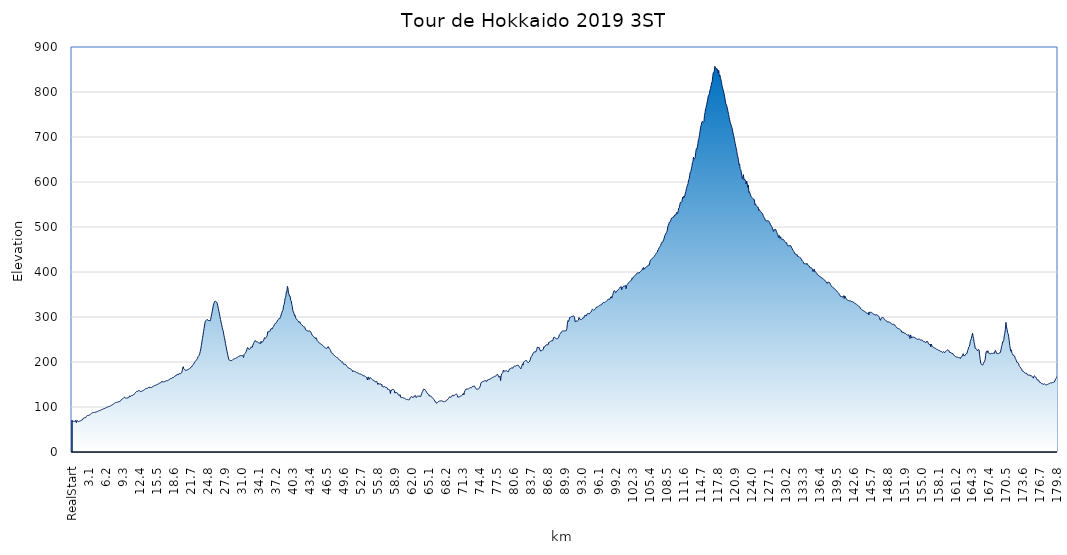
| Category | Ekevation |
|---|---|
| RealStart | 70.3 |
| 0.1  | 68.4 |
| 0.2  | 68.2 |
| 0.3  | 68.1 |
| 0.4  | 68.1 |
| 0.5  | 67.9 |
| 0.6  | 67.9 |
| 0.7  | 70.4 |
| 0.8  | 65 |
| 0.9  | 70.1 |
| 1.0  | 69.1 |
| 1.1  | 68 |
| 1.2  | 67.6 |
| 1.3  | 68.1 |
| 1.4  | 68.6 |
| 1.5  | 69 |
| 1.6  | 69.8 |
| 1.7  | 70.6 |
| 1.8  | 70.9 |
| 1.9  | 71.3 |
| 2.0  | 74.3 |
| 2.1  | 74.9 |
| 2.2  | 75.3 |
| 2.3  | 76.2 |
| 2.4  | 76.2 |
| 2.5  | 76.2 |
| 2.6  | 79 |
| 2.7  | 79.9 |
| 2.8  | 80.8 |
| 2.9  | 81.4 |
| 3.0  | 81.3 |
| 3.1  | 82 |
| 3.2  | 82.1 |
| 3.3  | 83 |
| 3.4  | 84.5 |
| 3.5  | 85.6 |
| 3.6  | 86.2 |
| 3.7  | 86.8 |
| 3.8  | 87.3 |
| 3.9  | 87.8 |
| 4.0  | 88.1 |
| 4.1  | 88 |
| 4.2  | 88.1 |
| 4.3  | 88.5 |
| 4.4  | 88.9 |
| 4.5  | 89.3 |
| 4.6  | 89.7 |
| 4.7  | 90.1 |
| 4.8  | 91 |
| 4.9  | 91.8 |
| 5.0  | 92 |
| 5.1  | 92.4 |
| 5.2  | 92.9 |
| 5.3  | 93.5 |
| 5.4  | 94.2 |
| 5.5  | 94.5 |
| 5.6  | 95.1 |
| 5.7  | 96 |
| 5.8  | 96 |
| 5.9  | 96.4 |
| 6.0  | 97 |
| 6.1  | 97.6 |
| 6.2  | 98.3 |
| 6.3  | 99 |
| 6.4  | 99.5 |
| 6.5  | 100.2 |
| 6.6  | 100.5 |
| 6.7  | 100.8 |
| 6.8  | 101.3 |
| 6.9  | 101.7 |
| 7.0  | 102.4 |
| 7.1  | 103.2 |
| 7.2  | 103.9 |
| 7.3  | 104.2 |
| 7.4  | 105.2 |
| 7.5  | 106 |
| 7.6  | 106.9 |
| 7.7  | 107.8 |
| 7.8  | 108.6 |
| 7.9  | 109.7 |
| 8.0  | 110.1 |
| 8.1  | 110.3 |
| 8.2  | 110.5 |
| 8.3  | 110.7 |
| 8.4  | 111.1 |
| 8.5  | 111.6 |
| 8.6  | 112.2 |
| 8.7  | 112.3 |
| 8.8  | 112.7 |
| 8.9  | 114.5 |
| 9.0  | 116.3 |
| 9.1  | 117.6 |
| 9.2  | 118.2 |
| 9.3  | 118.5 |
| 9.4  | 119.5 |
| 9.5  | 121.1 |
| 9.6  | 121.8 |
| 9.7  | 120.6 |
| 9.8  | 120 |
| 9.9  | 120 |
| 10.0  | 119.7 |
| 10.1  | 120.2 |
| 10.2  | 120.3 |
| 10.3  | 120.7 |
| 10.4  | 121.5 |
| 10.5  | 124.9 |
| 10.6  | 122.8 |
| 10.7  | 123.9 |
| 10.8  | 124.9 |
| 10.9  | 125.5 |
| 11.0  | 125.5 |
| 11.1  | 125.9 |
| 11.2  | 127.3 |
| 11.3  | 127.7 |
| 11.4  | 129.4 |
| 11.5  | 130.4 |
| 11.6  | 132.4 |
| 11.7  | 133.4 |
| 11.8  | 134.6 |
| 11.9  | 134 |
| 12.0  | 134.7 |
| 12.1  | 136.5 |
| 12.2  | 136.4 |
| 12.3  | 136 |
| 12.4  | 135.3 |
| 12.5  | 134.7 |
| 12.6  | 134.3 |
| 12.7  | 134.8 |
| 12.8  | 135.4 |
| 12.9  | 136.2 |
| 13.0  | 136.8 |
| 13.1  | 137.3 |
| 13.2  | 138.3 |
| 13.3  | 139.5 |
| 13.4  | 140.5 |
| 13.5  | 140.6 |
| 13.6  | 141.1 |
| 13.7  | 141.5 |
| 13.8  | 141.5 |
| 13.9  | 142.6 |
| 14.0  | 143.9 |
| 14.1  | 144.5 |
| 14.2  | 142.5 |
| 14.3  | 143.3 |
| 14.4  | 143.6 |
| 14.5  | 143.5 |
| 14.6  | 144.2 |
| 14.7  | 145 |
| 14.8  | 145.8 |
| 14.9  | 146.3 |
| 15.0  | 147.1 |
| 15.1  | 147.8 |
| 15.2  | 148.2 |
| 15.3  | 148.6 |
| 15.4  | 149 |
| 15.5  | 149 |
| 15.6  | 150.6 |
| 15.7  | 151.3 |
| 15.8  | 151.7 |
| 15.9  | 152.2 |
| 16.0  | 153.2 |
| 16.1  | 153.7 |
| 16.2  | 154.1 |
| 16.3  | 154.7 |
| 16.4  | 157.3 |
| 16.5  | 156 |
| 16.6  | 156.2 |
| 16.7  | 156 |
| 16.8  | 156.8 |
| 16.9  | 156.3 |
| 17.0  | 157.1 |
| 17.1  | 157.7 |
| 17.2  | 158.2 |
| 17.3  | 158.5 |
| 17.4  | 158.7 |
| 17.5  | 158.5 |
| 17.6  | 159.4 |
| 17.7  | 161.2 |
| 17.8  | 161.5 |
| 17.9  | 162.9 |
| 18.0  | 163 |
| 18.1  | 163.1 |
| 18.2  | 163.7 |
| 18.3  | 165.4 |
| 18.4  | 165.3 |
| 18.5  | 165.4 |
| 18.6  | 167.1 |
| 18.7  | 167.9 |
| 18.8  | 168.7 |
| 18.9  | 169 |
| 19.0  | 170.9 |
| 19.1  | 171 |
| 19.2  | 171.7 |
| 19.3  | 173.6 |
| 19.4  | 171.8 |
| 19.5  | 172.3 |
| 19.6  | 174.5 |
| 19.7  | 174.7 |
| 19.8  | 174.1 |
| 19.9  | 174.6 |
| 20.0  | 176.1 |
| 20.1  | 180.3 |
| 20.2  | 186.5 |
| 20.3  | 189.6 |
| 20.4  | 184.8 |
| 20.5  | 183.6 |
| 20.6  | 182.4 |
| 20.7  | 181.8 |
| 20.8  | 180.6 |
| 20.9  | 182.5 |
| 21.0  | 182.5 |
| 21.1  | 182.9 |
| 21.2  | 183.4 |
| 21.3  | 184.4 |
| 21.4  | 185 |
| 21.5  | 185.7 |
| 21.6  | 186.3 |
| 21.7  | 188.5 |
| 21.8  | 189.7 |
| 21.9  | 190 |
| 22.0  | 192.4 |
| 22.1  | 194.5 |
| 22.2  | 195.3 |
| 22.3  | 197.6 |
| 22.4  | 199.6 |
| 22.5  | 201.3 |
| 22.6  | 202.9 |
| 22.7  | 204.5 |
| 22.8  | 206.2 |
| 22.9  | 208.3 |
| 23.0  | 211.8 |
| 23.1  | 213.1 |
| 23.2  | 215.2 |
| 23.3  | 218.6 |
| 23.4  | 223.6 |
| 23.5  | 228.8 |
| 23.6  | 237 |
| 23.7  | 244.6 |
| 23.8  | 252.1 |
| 23.9  | 259.5 |
| 24.0  | 267.3 |
| 24.1  | 274.6 |
| 24.2  | 282.2 |
| 24.3  | 289.3 |
| 24.4  | 291.7 |
| 24.5  | 292.6 |
| 24.6  | 294.1 |
| 24.7  | 294.3 |
| 24.8  | 292.2 |
| 24.9  | 292.2 |
| 25.0  | 293 |
| 25.1  | 291.6 |
| 25.2  | 291.2 |
| 25.3  | 294.8 |
| 25.4  | 300.9 |
| 25.5  | 307 |
| 25.6  | 313.1 |
| 25.7  | 319.8 |
| 25.8  | 326.7 |
| 25.9  | 330.5 |
| 26.0  | 334 |
| 26.1  | 335.2 |
| 26.2  | 334.7 |
| 26.3  | 333.8 |
| 26.4  | 333 |
| 26.5  | 330.2 |
| 26.6  | 324.9 |
| 26.7  | 319.1 |
| 26.8  | 312.9 |
| 26.9  | 307.1 |
| 27.0  | 300.7 |
| 27.1  | 294.6 |
| 27.2  | 288.7 |
| 27.3  | 282.9 |
| 27.4  | 276.9 |
| 27.5  | 271.7 |
| 27.6  | 268.4 |
| 27.7  | 260.5 |
| 27.8  | 254.7 |
| 27.9  | 248.9 |
| 28.0  | 241.1 |
| 28.1  | 235 |
| 28.2  | 228.7 |
| 28.3  | 222.8 |
| 28.4  | 216.9 |
| 28.5  | 211.2 |
| 28.6  | 206.1 |
| 28.7  | 204 |
| 28.8  | 203.6 |
| 28.9  | 203.3 |
| 29.0  | 203 |
| 29.1  | 203.1 |
| 29.2  | 203.6 |
| 29.3  | 205 |
| 29.4  | 206 |
| 29.5  | 206.7 |
| 29.6  | 207.1 |
| 29.7  | 207.4 |
| 29.8  | 208.1 |
| 29.9  | 208.5 |
| 30.0  | 209.3 |
| 30.1  | 209.8 |
| 30.2  | 210.7 |
| 30.3  | 211.7 |
| 30.4  | 212.4 |
| 30.5  | 212.8 |
| 30.6  | 213.6 |
| 30.7  | 213.9 |
| 30.8  | 214.2 |
| 30.9  | 214.2 |
| 31.0  | 214.3 |
| 31.1  | 214.4 |
| 31.2  | 213.4 |
| 31.3  | 210 |
| 31.4  | 217 |
| 31.5  | 218.3 |
| 31.6  | 219.3 |
| 31.7  | 221.4 |
| 31.8  | 223.8 |
| 31.9  | 227.5 |
| 32.0  | 231.6 |
| 32.1  | 232 |
| 32.2  | 230.2 |
| 32.3  | 227.8 |
| 32.4  | 228.6 |
| 32.5  | 229.4 |
| 32.6  | 230.9 |
| 32.7  | 234 |
| 32.8  | 232.3 |
| 32.9  | 233.1 |
| 33.0  | 237.6 |
| 33.1  | 240.4 |
| 33.2  | 243.2 |
| 33.3  | 246 |
| 33.4  | 247.9 |
| 33.5  | 247 |
| 33.6  | 245 |
| 33.7  | 245 |
| 33.8  | 244.8 |
| 33.9  | 244 |
| 34.0  | 243 |
| 34.1  | 242.5 |
| 34.2  | 241.9 |
| 34.3  | 242.8 |
| 34.4  | 241 |
| 34.5  | 246 |
| 34.6  | 243 |
| 34.7  | 244 |
| 34.8  | 245 |
| 34.9  | 247 |
| 35.0  | 249 |
| 35.1  | 254 |
| 35.2  | 253 |
| 35.3  | 253 |
| 35.4  | 254 |
| 35.5  | 256 |
| 35.6  | 258 |
| 35.7  | 267 |
| 35.8  | 266 |
| 35.9  | 268 |
| 36.0  | 268 |
| 36.1  | 268 |
| 36.2  | 271 |
| 36.3  | 274 |
| 36.4  | 274 |
| 36.5  | 273 |
| 36.6  | 276 |
| 36.7  | 278 |
| 36.8  | 279 |
| 36.9  | 283 |
| 37.0  | 284 |
| 37.1  | 286 |
| 37.2  | 286 |
| 37.3  | 288 |
| 37.4  | 289 |
| 37.5  | 293 |
| 37.6  | 294 |
| 37.7  | 295 |
| 37.8  | 297 |
| 37.9  | 296 |
| 38.0  | 299 |
| 38.1  | 302 |
| 38.2  | 307 |
| 38.3  | 310 |
| 38.4  | 314 |
| 38.5  | 315 |
| 38.6  | 325 |
| 38.7  | 327 |
| 38.8  | 334 |
| 38.9  | 343 |
| 39.0  | 344 |
| 39.1  | 356 |
| 39.2  | 355 |
| 39.3  | 368 |
| 39.4  | 364 |
| 39.5  | 353 |
| 39.6  | 351 |
| 39.7  | 346 |
| 39.8  | 346 |
| 39.9  | 337 |
| 40.0  | 336 |
| 40.1  | 328 |
| 40.2  | 323 |
| 40.3  | 314 |
| 40.4  | 311 |
| 40.5  | 308 |
| 40.6  | 303 |
| 40.7  | 304 |
| 40.8  | 298 |
| 40.9  | 296 |
| 41.0  | 295 |
| 41.1  | 293 |
| 41.2  | 292 |
| 41.3  | 291 |
| 41.4  | 288 |
| 41.5  | 289 |
| 41.6  | 289 |
| 41.7  | 285 |
| 41.8  | 284 |
| 41.9  | 283 |
| 42.0  | 282 |
| 42.1  | 280 |
| 42.2  | 279 |
| 42.3  | 278 |
| 42.4  | 278 |
| 42.5  | 277 |
| 42.6  | 272 |
| 42.7  | 272 |
| 42.8  | 270 |
| 42.9  | 270 |
| 43.0  | 269 |
| 43.1  | 268 |
| 43.2  | 269 |
| 43.3  | 269 |
| 43.4  | 269 |
| 43.5  | 268 |
| 43.6  | 266 |
| 43.7  | 263 |
| 43.8  | 260 |
| 43.9  | 259 |
| 44.0  | 257 |
| 44.1  | 256 |
| 44.2  | 255 |
| 44.3  | 255 |
| 44.4  | 252 |
| 44.5  | 254 |
| 44.6  | 253 |
| 44.7  | 248 |
| 44.8  | 246.6 |
| 44.9  | 245.9 |
| 45.0  | 244.7 |
| 45.1  | 242.6 |
| 45.2  | 241.3 |
| 45.3  | 240.9 |
| 45.4  | 239.9 |
| 45.5  | 239 |
| 45.6  | 238.4 |
| 45.7  | 237.2 |
| 45.8  | 236.2 |
| 45.9  | 234.6 |
| 46.0  | 233.6 |
| 46.1  | 232.7 |
| 46.2  | 231.6 |
| 46.3  | 230.7 |
| 46.4  | 230.1 |
| 46.5  | 231.1 |
| 46.6  | 231.2 |
| 46.7  | 233.8 |
| 46.8  | 233.6 |
| 46.9  | 230.5 |
| 47.0  | 229 |
| 47.1  | 228 |
| 47.2  | 225 |
| 47.3  | 221 |
| 47.4  | 220 |
| 47.5  | 219.8 |
| 47.6  | 218.6 |
| 47.7  | 216.3 |
| 47.8  | 214.9 |
| 47.9  | 214.2 |
| 48.0  | 213 |
| 48.1  | 212 |
| 48.2  | 211 |
| 48.3  | 210 |
| 48.4  | 210 |
| 48.5  | 208.3 |
| 48.6  | 207.3 |
| 48.7  | 205.5 |
| 48.8  | 204.3 |
| 48.9  | 204.5 |
| 49.0  | 203.4 |
| 49.1  | 201 |
| 49.2  | 200 |
| 49.3  | 201 |
| 49.4  | 199 |
| 49.5  | 196 |
| 49.6  | 195 |
| 49.7  | 195 |
| 49.8  | 196 |
| 49.9  | 195 |
| 50.0  | 193 |
| 50.1  | 191 |
| 50.2  | 190 |
| 50.3  | 189 |
| 50.4  | 187 |
| 50.5  | 186 |
| 50.6  | 186 |
| 50.7  | 185 |
| 50.8  | 185 |
| 50.9  | 184.1 |
| 51.0  | 183.1 |
| 51.1  | 181.9 |
| 51.2  | 178.6 |
| 51.3  | 180.3 |
| 51.4  | 179.7 |
| 51.5  | 179.3 |
| 51.6  | 178.9 |
| 51.7  | 178.5 |
| 51.8  | 177.9 |
| 51.9  | 176.8 |
| 52.0  | 176.2 |
| 52.1  | 175.8 |
| 52.2  | 175.3 |
| 52.3  | 174.7 |
| 52.4  | 173.9 |
| 52.5  | 173.4 |
| 52.6  | 173.2 |
| 52.7  | 172.9 |
| 52.8  | 172.3 |
| 52.9  | 171.4 |
| 53.0  | 170.6 |
| 53.1  | 169.5 |
| 53.2  | 169.4 |
| 53.3  | 169.3 |
| 53.4  | 168.8 |
| 53.5  | 167.8 |
| 53.6  | 167.2 |
| 53.7  | 166.2 |
| 53.8  | 165.4 |
| 53.9  | 160 |
| 54.0  | 166.4 |
| 54.1  | 166.4 |
| 54.2  | 161 |
| 54.3  | 164 |
| 54.4  | 165.8 |
| 54.5  | 164.7 |
| 54.6  | 163.3 |
| 54.7  | 161.9 |
| 54.8  | 160.9 |
| 54.9  | 159.9 |
| 55.0  | 159.4 |
| 55.1  | 159 |
| 55.2  | 158 |
| 55.3  | 156 |
| 55.4  | 156 |
| 55.5  | 156 |
| 55.6  | 157 |
| 55.7  | 154 |
| 55.8  | 150 |
| 55.9  | 152.5 |
| 56.0  | 151.1 |
| 56.1  | 151 |
| 56.2  | 151.7 |
| 56.3  | 151.7 |
| 56.4  | 149.8 |
| 56.5  | 151.1 |
| 56.6  | 145 |
| 56.7  | 146 |
| 56.8  | 145 |
| 56.9  | 145 |
| 57.0  | 145.7 |
| 57.1  | 144.1 |
| 57.2  | 143.9 |
| 57.3  | 143.7 |
| 57.4  | 143.3 |
| 57.5  | 142.8 |
| 57.6  | 139 |
| 57.7  | 139 |
| 57.8  | 139 |
| 57.9  | 138.2 |
| 58.0  | 137.6 |
| 58.1  | 130 |
| 58.2  | 137.7 |
| 58.3  | 136.7 |
| 58.4  | 139 |
| 58.5  | 139 |
| 58.6  | 139.3 |
| 58.7  | 138.7 |
| 58.8  | 136.9 |
| 58.9  | 131 |
| 59.0  | 131 |
| 59.1  | 133.1 |
| 59.2  | 132.2 |
| 59.3  | 131.5 |
| 59.4  | 130.7 |
| 59.5  | 128 |
| 59.6  | 126 |
| 59.7  | 125 |
| 59.8  | 127.6 |
| 59.9  | 126.8 |
| 60.0  | 121 |
| 60.1  | 121 |
| 60.2  | 121 |
| 60.3  | 121 |
| 60.4  | 121 |
| 60.5  | 120 |
| 60.6  | 120 |
| 60.7  | 119 |
| 60.8  | 118 |
| 60.9  | 118 |
| 61.0  | 117 |
| 61.1  | 116 |
| 61.2  | 117 |
| 61.3  | 116 |
| 61.4  | 116 |
| 61.5  | 116 |
| 61.6  | 117 |
| 61.7  | 121 |
| 61.8  | 121.7 |
| 61.9  | 122.6 |
| 62.0  | 123.2 |
| 62.1  | 121 |
| 62.2  | 122 |
| 62.3  | 122 |
| 62.4  | 122 |
| 62.5  | 125 |
| 62.6  | 126 |
| 62.7  | 125 |
| 62.8  | 121 |
| 62.9  | 123 |
| 63.0  | 124 |
| 63.1  | 124 |
| 63.2  | 124 |
| 63.3  | 124 |
| 63.4  | 124 |
| 63.5  | 125 |
| 63.6  | 123 |
| 63.7  | 126 |
| 63.8  | 130 |
| 63.9  | 133 |
| 64.0  | 135 |
| 64.1  | 139 |
| 64.2  | 140 |
| 64.3  | 139 |
| 64.4  | 139 |
| 64.5  | 137 |
| 64.6  | 135 |
| 64.7  | 133 |
| 64.8  | 131 |
| 64.9  | 129 |
| 65.0  | 128 |
| 65.1  | 128 |
| 65.2  | 124 |
| 65.3  | 125.6 |
| 65.4  | 124.5 |
| 65.5  | 123 |
| 65.6  | 122.4 |
| 65.7  | 121.3 |
| 65.8  | 120.5 |
| 65.9  | 119 |
| 66.0  | 117.1 |
| 66.1  | 115.6 |
| 66.2  | 113.5 |
| 66.3  | 111.1 |
| 66.4  | 110.8 |
| 66.5  | 108.4 |
| 66.6  | 109 |
| 66.7  | 110.1 |
| 66.8  | 111.5 |
| 66.9  | 112.5 |
| 67.0  | 112.9 |
| 67.1  | 113.3 |
| 67.2  | 113.5 |
| 67.3  | 113.7 |
| 67.4  | 113.8 |
| 67.5  | 113 |
| 67.6  | 113.1 |
| 67.7  | 112.8 |
| 67.8  | 111.9 |
| 67.9  | 112 |
| 68.0  | 112 |
| 68.1  | 112 |
| 68.2  | 113 |
| 68.3  | 115 |
| 68.4  | 115 |
| 68.5  | 116 |
| 68.6  | 118 |
| 68.7  | 119 |
| 68.8  | 121 |
| 68.9  | 123 |
| 69.0  | 122 |
| 69.1  | 121 |
| 69.2  | 123 |
| 69.3  | 125 |
| 69.4  | 126 |
| 69.5  | 124 |
| 69.6  | 126 |
| 69.7  | 125.1 |
| 69.8  | 126.1 |
| 69.9  | 127.3 |
| 70.0  | 128.2 |
| 70.1  | 129 |
| 70.2  | 128.4 |
| 70.3  | 125.7 |
| 70.4  | 121.6 |
| 70.5  | 122 |
| 70.6  | 122.6 |
| 70.7  | 122.8 |
| 70.8  | 123.9 |
| 70.9  | 124.3 |
| 71.0  | 124.7 |
| 71.1  | 125.3 |
| 71.2  | 126.5 |
| 71.3  | 128.7 |
| 71.4  | 130.2 |
| 71.5  | 126.8 |
| 71.6  | 132.9 |
| 71.7  | 136.6 |
| 71.8  | 137.8 |
| 71.9  | 140 |
| 72.0  | 140 |
| 72.1  | 140 |
| 72.2  | 140 |
| 72.3  | 140 |
| 72.4  | 141 |
| 72.5  | 142 |
| 72.6  | 142 |
| 72.7  | 143 |
| 72.8  | 143 |
| 72.9  | 143 |
| 73.0  | 144 |
| 73.1  | 146 |
| 73.2  | 146 |
| 73.3  | 146 |
| 73.4  | 147 |
| 73.5  | 145 |
| 73.6  | 142.7 |
| 73.7  | 140.7 |
| 73.8  | 139.7 |
| 73.9  | 139.5 |
| 74.0  | 139.8 |
| 74.1  | 140.1 |
| 74.2  | 140.4 |
| 74.3  | 141.4 |
| 74.4  | 144 |
| 74.5  | 147 |
| 74.6  | 153 |
| 74.7  | 155 |
| 74.8  | 155.7 |
| 74.9  | 156.2 |
| 75.0  | 156.5 |
| 75.1  | 157.2 |
| 75.2  | 157.7 |
| 75.3  | 158.3 |
| 75.4  | 158 |
| 75.5  | 159 |
| 75.6  | 157 |
| 75.7  | 157 |
| 75.8  | 160 |
| 75.9  | 160 |
| 76.0  | 161 |
| 76.1  | 162 |
| 76.2  | 161 |
| 76.3  | 163 |
| 76.4  | 163 |
| 76.5  | 164 |
| 76.6  | 164.6 |
| 76.7  | 165.3 |
| 76.8  | 166.6 |
| 76.9  | 166.5 |
| 77.0  | 167.5 |
| 77.1  | 168 |
| 77.2  | 168.4 |
| 77.3  | 169 |
| 77.4  | 170.2 |
| 77.5  | 170.8 |
| 77.6  | 172.6 |
| 77.7  | 171.9 |
| 77.8  | 168.5 |
| 77.9  | 166 |
| 78.0  | 166.9 |
| 78.1  | 168.5 |
| 78.2  | 158.6 |
| 78.3  | 169.2 |
| 78.4  | 173.9 |
| 78.5  | 175.1 |
| 78.6  | 176 |
| 78.7  | 181.7 |
| 78.8  | 179.4 |
| 78.9  | 180 |
| 79.0  | 180 |
| 79.1  | 180.2 |
| 79.2  | 181.2 |
| 79.3  | 180.3 |
| 79.4  | 179.4 |
| 79.5  | 178.9 |
| 79.6  | 178.2 |
| 79.7  | 180.7 |
| 79.8  | 184.3 |
| 79.9  | 185.1 |
| 80.0  | 185.2 |
| 80.1  | 186.4 |
| 80.2  | 186.8 |
| 80.3  | 187 |
| 80.4  | 186 |
| 80.5  | 188.8 |
| 80.6  | 189.4 |
| 80.7  | 190.5 |
| 80.8  | 190.8 |
| 80.9  | 190.6 |
| 81.0  | 191.5 |
| 81.1  | 192.1 |
| 81.2  | 192.4 |
| 81.3  | 192.7 |
| 81.4  | 192.8 |
| 81.5  | 191.8 |
| 81.6  | 189.6 |
| 81.7  | 187.6 |
| 81.8  | 187 |
| 81.9  | 185 |
| 82.0  | 188 |
| 82.1  | 192 |
| 82.2  | 196 |
| 82.3  | 193 |
| 82.4  | 199.7 |
| 82.5  | 200.5 |
| 82.6  | 201.6 |
| 82.7  | 202.7 |
| 82.8  | 203.7 |
| 82.9  | 203.5 |
| 83.0  | 201.8 |
| 83.1  | 199.6 |
| 83.2  | 198.4 |
| 83.3  | 199 |
| 83.4  | 199.9 |
| 83.5  | 201.6 |
| 83.6  | 204.7 |
| 83.7  | 209 |
| 83.8  | 212 |
| 83.9  | 213.4 |
| 84.0  | 215.7 |
| 84.1  | 218.2 |
| 84.2  | 220.6 |
| 84.3  | 220.8 |
| 84.4  | 222.9 |
| 84.5  | 223 |
| 84.6  | 222 |
| 84.7  | 225 |
| 84.8  | 228 |
| 84.9  | 233 |
| 85.0  | 232 |
| 85.1  | 232 |
| 85.2  | 233 |
| 85.3  | 229.1 |
| 85.4  | 226.8 |
| 85.5  | 224 |
| 85.6  | 225.6 |
| 85.7  | 225.1 |
| 85.8  | 226.7 |
| 85.9  | 227.7 |
| 86.0  | 228 |
| 86.1  | 234 |
| 86.2  | 233 |
| 86.3  | 235 |
| 86.4  | 237 |
| 86.5  | 238 |
| 86.6  | 238.1 |
| 86.7  | 237.1 |
| 86.8  | 239.3 |
| 86.9  | 239 |
| 87.0  | 244 |
| 87.1  | 244 |
| 87.2  | 245 |
| 87.3  | 246 |
| 87.4  | 247 |
| 87.5  | 247 |
| 87.6  | 247 |
| 87.7  | 247 |
| 87.8  | 251.1 |
| 87.9  | 255.1 |
| 88.0  | 255.5 |
| 88.1  | 254.1 |
| 88.2  | 253.3 |
| 88.3  | 252.5 |
| 88.4  | 251.7 |
| 88.5  | 251.1 |
| 88.6  | 251.7 |
| 88.7  | 253.3 |
| 88.8  | 255 |
| 88.9  | 260.1 |
| 89.0  | 261.2 |
| 89.1  | 263.5 |
| 89.2  | 264.2 |
| 89.3  | 267 |
| 89.4  | 268 |
| 89.5  | 269 |
| 89.6  | 269 |
| 89.7  | 269 |
| 89.8  | 269 |
| 89.9  | 269 |
| 90.0  | 269 |
| 90.1  | 270 |
| 90.2  | 270 |
| 90.3  | 275 |
| 90.4  | 287 |
| 90.5  | 292 |
| 90.6  | 290 |
| 90.7  | 293.8 |
| 90.8  | 299.1 |
| 90.9  | 299 |
| 91.0  | 299.7 |
| 91.1  | 300.6 |
| 91.2  | 301.3 |
| 91.3  | 301.4 |
| 91.4  | 301 |
| 91.5  | 302.9 |
| 91.6  | 301.4 |
| 91.7  | 298.1 |
| 91.8  | 289.3 |
| 91.9  | 290 |
| 92.0  | 292 |
| 92.1  | 290.3 |
| 92.2  | 290.7 |
| 92.3  | 291.9 |
| 92.4  | 292.9 |
| 92.5  | 299 |
| 92.6  | 296 |
| 92.7  | 296 |
| 92.8  | 294 |
| 92.9  | 294 |
| 93.0  | 295 |
| 93.1  | 296 |
| 93.2  | 298 |
| 93.3  | 298 |
| 93.4  | 298 |
| 93.5  | 303 |
| 93.6  | 303 |
| 93.7  | 304 |
| 93.8  | 302 |
| 93.9  | 304 |
| 94.0  | 307 |
| 94.1  | 308 |
| 94.2  | 308 |
| 94.3  | 307 |
| 94.4  | 307 |
| 94.5  | 309.3 |
| 94.6  | 309.9 |
| 94.7  | 311.3 |
| 94.8  | 314 |
| 94.9  | 317 |
| 95.0  | 317 |
| 95.1  | 316 |
| 95.2  | 315 |
| 95.3  | 316 |
| 95.4  | 317 |
| 95.5  | 319 |
| 95.6  | 320 |
| 95.7  | 322 |
| 95.8  | 321.7 |
| 95.9  | 322.5 |
| 96.0  | 323.4 |
| 96.1  | 324.6 |
| 96.2  | 325.4 |
| 96.3  | 326 |
| 96.4  | 326.6 |
| 96.5  | 327 |
| 96.6  | 327.3 |
| 96.7  | 328.7 |
| 96.8  | 330.8 |
| 96.9  | 332 |
| 97.0  | 332.2 |
| 97.1  | 332.1 |
| 97.2  | 332.2 |
| 97.3  | 332.9 |
| 97.4  | 334.1 |
| 97.5  | 335.4 |
| 97.6  | 336.6 |
| 97.7  | 337.7 |
| 97.8  | 338.4 |
| 97.9  | 339.3 |
| 98.0  | 340.4 |
| 98.1  | 339 |
| 98.2  | 342 |
| 98.3  | 344.3 |
| 98.4  | 345.3 |
| 98.5  | 342 |
| 98.6  | 347.5 |
| 98.7  | 350.8 |
| 98.8  | 354.9 |
| 98.9  | 358.4 |
| 99.0  | 358.4 |
| 99.1  | 356.6 |
| 99.2  | 354 |
| 99.3  | 356 |
| 99.4  | 358 |
| 99.5  | 359 |
| 99.6  | 359 |
| 99.7  | 361 |
| 99.8  | 363 |
| 99.9  | 364.2 |
| 100.0  | 366 |
| 100.1  | 366.6 |
| 100.2  | 367.8 |
| 100.3  | 360.5 |
| 100.4  | 365.6 |
| 100.5  | 366 |
| 100.6  | 368 |
| 100.7  | 368.5 |
| 100.8  | 368.9 |
| 100.9  | 369.3 |
| 101.0  | 369.8 |
| 101.1  | 362.7 |
| 101.2  | 370.3 |
| 101.3  | 371.9 |
| 101.4  | 373.5 |
| 101.5  | 375.1 |
| 101.6  | 376.5 |
| 101.7  | 377.9 |
| 101.8  | 379.3 |
| 101.9  | 380.6 |
| 102.0  | 380.9 |
| 102.1  | 382 |
| 102.2  | 387 |
| 102.3  | 386 |
| 102.4  | 388 |
| 102.5  | 390 |
| 102.6  | 391 |
| 102.7  | 392 |
| 102.8  | 393 |
| 102.9  | 394 |
| 103.0  | 396 |
| 103.1  | 398 |
| 103.2  | 398 |
| 103.3  | 398 |
| 103.4  | 398 |
| 103.5  | 398 |
| 103.6  | 400 |
| 103.7  | 401 |
| 103.8  | 402 |
| 103.9  | 403 |
| 104.0  | 404.4 |
| 104.1  | 407.6 |
| 104.2  | 405.6 |
| 104.3  | 410.3 |
| 104.4  | 406.8 |
| 104.5  | 407.1 |
| 104.6  | 408.7 |
| 104.7  | 410.4 |
| 104.8  | 411.6 |
| 104.9  | 412.4 |
| 105.0  | 412.9 |
| 105.1  | 413.8 |
| 105.2  | 415.7 |
| 105.3  | 415 |
| 105.4  | 420.7 |
| 105.5  | 424.9 |
| 105.6  | 427.3 |
| 105.7  | 428.3 |
| 105.8  | 429.4 |
| 105.9  | 430.4 |
| 106.0  | 431.5 |
| 106.1  | 432.8 |
| 106.2  | 434.1 |
| 106.3  | 436.1 |
| 106.4  | 437.9 |
| 106.5  | 439.4 |
| 106.6  | 441.3 |
| 106.7  | 443.3 |
| 106.8  | 444.3 |
| 106.9  | 449 |
| 107.0  | 450 |
| 107.1  | 454 |
| 107.2  | 455 |
| 107.3  | 457 |
| 107.4  | 459 |
| 107.5  | 463 |
| 107.6  | 466 |
| 107.7  | 466 |
| 107.8  | 467 |
| 107.9  | 471 |
| 108.0  | 473 |
| 108.1  | 478 |
| 108.2  | 482 |
| 108.3  | 484 |
| 108.4  | 487 |
| 108.5  | 488 |
| 108.6  | 492 |
| 108.7  | 500 |
| 108.8  | 504 |
| 108.9  | 507 |
| 109.0  | 511 |
| 109.1  | 511 |
| 109.2  | 512 |
| 109.3  | 517 |
| 109.4  | 520 |
| 109.5  | 521 |
| 109.6  | 521 |
| 109.7  | 521 |
| 109.8  | 524 |
| 109.9  | 524 |
| 110.0  | 527 |
| 110.1  | 527 |
| 110.2  | 527 |
| 110.3  | 532 |
| 110.4  | 532 |
| 110.5  | 530 |
| 110.6  | 536 |
| 110.7  | 542 |
| 110.8  | 543 |
| 110.9  | 549 |
| 111.0  | 555 |
| 111.1  | 554 |
| 111.2  | 555 |
| 111.3  | 557 |
| 111.4  | 566 |
| 111.5  | 564 |
| 111.6  | 568 |
| 111.7  | 566 |
| 111.8  | 569 |
| 111.9  | 575 |
| 112.0  | 579 |
| 112.1  | 585 |
| 112.2  | 589 |
| 112.3  | 593 |
| 112.4  | 596 |
| 112.5  | 605 |
| 112.6  | 606 |
| 112.7  | 615 |
| 112.8  | 622 |
| 112.9  | 623 |
| 113.0  | 629 |
| 113.1  | 634 |
| 113.2  | 643 |
| 113.3  | 646 |
| 113.4  | 655 |
| 113.5  | 651 |
| 113.6  | 652 |
| 113.7  | 654 |
| 113.8  | 665 |
| 113.9  | 674 |
| 114.0  | 673 |
| 114.1  | 678 |
| 114.2  | 685 |
| 114.3  | 695 |
| 114.4  | 697 |
| 114.5  | 706 |
| 114.6  | 713 |
| 114.7  | 722 |
| 114.8  | 726 |
| 114.9  | 732 |
| 115.0  | 735 |
| 115.1  | 734 |
| 115.2  | 733 |
| 115.3  | 734 |
| 115.4  | 748 |
| 115.5  | 754 |
| 115.6  | 763 |
| 115.7  | 766 |
| 115.8  | 772 |
| 115.9  | 778 |
| 116.0  | 784 |
| 116.1  | 792 |
| 116.2  | 793 |
| 116.3  | 797 |
| 116.4  | 804 |
| 116.5  | 808 |
| 116.6  | 814 |
| 116.7  | 820 |
| 116.8  | 823 |
| 116.9  | 834 |
| 117.0  | 843 |
| 117.1  | 843 |
| 117.2  | 847 |
| 117.3  | 857 |
| 117.4  | 853 |
| 117.5  | 853 |
| 117.6  | 852 |
| 117.7  | 852 |
| 117.8  | 846 |
| 117.9  | 842 |
| 118.0  | 848 |
| 118.1  | 835 |
| 118.2  | 838 |
| 118.3  | 832.4 |
| 118.4  | 827.2 |
| 118.5  | 821.8 |
| 118.6  | 814.5 |
| 118.7  | 809.3 |
| 118.8  | 804.9 |
| 118.9  | 799.9 |
| 119.0  | 794.9 |
| 119.1  | 787.9 |
| 119.2  | 780.4 |
| 119.3  | 771.9 |
| 119.4  | 771.8 |
| 119.5  | 767.1 |
| 119.6  | 761.9 |
| 119.7  | 755.7 |
| 119.8  | 750 |
| 119.9  | 743.3 |
| 120.0  | 738 |
| 120.1  | 732.2 |
| 120.2  | 728.5 |
| 120.3  | 724.7 |
| 120.4  | 721 |
| 120.5  | 715.5 |
| 120.6  | 709.1 |
| 120.7  | 704 |
| 120.8  | 697.9 |
| 120.9  | 692 |
| 121.0  | 685.6 |
| 121.1  | 679.6 |
| 121.2  | 674.3 |
| 121.3  | 667.2 |
| 121.4  | 659.5 |
| 121.5  | 655.3 |
| 121.6  | 648.5 |
| 121.7  | 638.2 |
| 121.8  | 640.3 |
| 121.9  | 629.4 |
| 122.0  | 628 |
| 122.1  | 622.2 |
| 122.2  | 614.9 |
| 122.3  | 607 |
| 122.4  | 609.8 |
| 122.5  | 616.4 |
| 122.6  | 605.4 |
| 122.7  | 607 |
| 122.8  | 604.6 |
| 122.9  | 601.6 |
| 123.0  | 595.5 |
| 123.1  | 602.2 |
| 123.2  | 596.7 |
| 123.3  | 588 |
| 123.4  | 593.1 |
| 123.5  | 577.1 |
| 123.6  | 578.4 |
| 123.7  | 575 |
| 123.8  | 571.3 |
| 123.9  | 567.9 |
| 124.0  | 566.2 |
| 124.1  | 564.6 |
| 124.2  | 563.3 |
| 124.3  | 562.3 |
| 124.4  | 562.1 |
| 124.5  | 560.2 |
| 124.6  | 549.5 |
| 124.7  | 551.5 |
| 124.8  | 548.3 |
| 124.9  | 546.2 |
| 125.0  | 545.7 |
| 125.1  | 543.5 |
| 125.2  | 543.9 |
| 125.3  | 536.9 |
| 125.4  | 538.7 |
| 125.5  | 536.5 |
| 125.6  | 534.5 |
| 125.7  | 533.4 |
| 125.8  | 532.7 |
| 125.9  | 530.9 |
| 126.0  | 529 |
| 126.1  | 525.9 |
| 126.2  | 523 |
| 126.3  | 520.6 |
| 126.4  | 518.7 |
| 126.5  | 515.1 |
| 126.6  | 514.2 |
| 126.7  | 512.7 |
| 126.8  | 514.7 |
| 126.9  | 513.4 |
| 127.0  | 512.9 |
| 127.1  | 513.7 |
| 127.2  | 511.7 |
| 127.3  | 509.7 |
| 127.4  | 506.2 |
| 127.5  | 504.6 |
| 127.6  | 501.8 |
| 127.7  | 500.2 |
| 127.8  | 497.4 |
| 127.9  | 493.1 |
| 128.0  | 490.2 |
| 128.1  | 494.5 |
| 128.2  | 494.1 |
| 128.3  | 494.7 |
| 128.4  | 494.5 |
| 128.5  | 490.6 |
| 128.6  | 487.8 |
| 128.7  | 484.8 |
| 128.8  | 482.6 |
| 128.9  | 476.8 |
| 129.0  | 481 |
| 129.1  | 480.3 |
| 129.2  | 474.6 |
| 129.3  | 478.1 |
| 129.4  | 474.4 |
| 129.5  | 472 |
| 129.6  | 472.8 |
| 129.7  | 472.9 |
| 129.8  | 472.3 |
| 129.9  | 470.5 |
| 130.0  | 468.6 |
| 130.1  | 467.7 |
| 130.2  | 465.4 |
| 130.3  | 465 |
| 130.4  | 465 |
| 130.5  | 460.5 |
| 130.6  | 458.4 |
| 130.7  | 457.5 |
| 130.8  | 459.3 |
| 130.9  | 458.1 |
| 131.0  | 459.5 |
| 131.1  | 458.7 |
| 131.2  | 457.5 |
| 131.3  | 453.7 |
| 131.4  | 452.2 |
| 131.5  | 449 |
| 131.6  | 447.6 |
| 131.7  | 445.7 |
| 131.8  | 443.9 |
| 131.9  | 440 |
| 132.0  | 439.7 |
| 132.1  | 438.9 |
| 132.2  | 438.5 |
| 132.3  | 438.7 |
| 132.4  | 434.3 |
| 132.5  | 434.2 |
| 132.6  | 434.7 |
| 132.7  | 433.6 |
| 132.8  | 432.3 |
| 132.9  | 431.2 |
| 133.0  | 430.2 |
| 133.1  | 428.8 |
| 133.2  | 425.5 |
| 133.3  | 424 |
| 133.4  | 422.9 |
| 133.5  | 419.6 |
| 133.6  | 418 |
| 133.7  | 418.4 |
| 133.8  | 418.6 |
| 133.9  | 417.9 |
| 134.0  | 417.4 |
| 134.1  | 419.3 |
| 134.2  | 415.8 |
| 134.3  | 415.3 |
| 134.4  | 414.7 |
| 134.5  | 413.7 |
| 134.6  | 410 |
| 134.7  | 409.4 |
| 134.8  | 409.8 |
| 134.9  | 409.4 |
| 135.0  | 408.2 |
| 135.1  | 406.3 |
| 135.2  | 400.9 |
| 135.3  | 403.4 |
| 135.4  | 406.7 |
| 135.5  | 400.6 |
| 135.6  | 401.5 |
| 135.7  | 399.9 |
| 135.8  | 397.9 |
| 135.9  | 396.6 |
| 136.0  | 394 |
| 136.1  | 393.4 |
| 136.2  | 392.8 |
| 136.3  | 391.1 |
| 136.4  | 390.2 |
| 136.5  | 390 |
| 136.6  | 389 |
| 136.7  | 387.1 |
| 136.8  | 386.8 |
| 136.9  | 386.5 |
| 137.0  | 385.3 |
| 137.1  | 384 |
| 137.2  | 383.2 |
| 137.3  | 382.4 |
| 137.4  | 380.7 |
| 137.5  | 379.3 |
| 137.6  | 378 |
| 137.7  | 375.6 |
| 137.8  | 374.5 |
| 137.9  | 377.4 |
| 138.0  | 377.1 |
| 138.1  | 377.3 |
| 138.2  | 376.8 |
| 138.3  | 375.2 |
| 138.4  | 372.4 |
| 138.5  | 369.6 |
| 138.6  | 367.9 |
| 138.7  | 367.4 |
| 138.8  | 365.8 |
| 138.9  | 365.2 |
| 139.0  | 364.7 |
| 139.1  | 362.8 |
| 139.2  | 361.6 |
| 139.3  | 360.9 |
| 139.4  | 359.4 |
| 139.5  | 358.3 |
| 139.6  | 356.7 |
| 139.7  | 355.3 |
| 139.8  | 354.1 |
| 139.9  | 352.9 |
| 140.0  | 350.1 |
| 140.1  | 348.6 |
| 140.2  | 345.8 |
| 140.3  | 346.5 |
| 140.4  | 345.6 |
| 140.5  | 344.3 |
| 140.6  | 344 |
| 140.7  | 346.7 |
| 140.8  | 347.2 |
| 140.9  | 341 |
| 141.0  | 347 |
| 141.1  | 344.4 |
| 141.2  | 341.9 |
| 141.3  | 339.4 |
| 141.4  | 338.4 |
| 141.5  | 337.7 |
| 141.6  | 337.1 |
| 141.7  | 336.6 |
| 141.8  | 336.4 |
| 141.9  | 335.5 |
| 142.0  | 335.8 |
| 142.1  | 335.7 |
| 142.2  | 334.6 |
| 142.3  | 334.1 |
| 142.4  | 334 |
| 142.5  | 333.4 |
| 142.6  | 332.8 |
| 142.7  | 331.4 |
| 142.8  | 330.8 |
| 142.9  | 329.6 |
| 143.0  | 329.2 |
| 143.1  | 328.5 |
| 143.2  | 327.4 |
| 143.3  | 326.3 |
| 143.4  | 325.7 |
| 143.5  | 324.7 |
| 143.6  | 323 |
| 143.7  | 322.4 |
| 143.8  | 320.7 |
| 143.9  | 318.2 |
| 144.0  | 317.5 |
| 144.1  | 316.2 |
| 144.2  | 315.2 |
| 144.3  | 314.8 |
| 144.4  | 314 |
| 144.5  | 312.9 |
| 144.6  | 312.8 |
| 144.7  | 311.5 |
| 144.8  | 310.6 |
| 144.9  | 309.4 |
| 145.0  | 308.4 |
| 145.1  | 307.4 |
| 145.2  | 308.5 |
| 145.3  | 310 |
| 145.4  | 304.6 |
| 145.5  | 310.7 |
| 145.6  | 310.8 |
| 145.7  | 310.4 |
| 145.8  | 311 |
| 145.9  | 309.8 |
| 146.0  | 308.6 |
| 146.1  | 307.8 |
| 146.2  | 307.1 |
| 146.3  | 306 |
| 146.4  | 305.7 |
| 146.5  | 304.2 |
| 146.6  | 304.5 |
| 146.7  | 305.1 |
| 146.8  | 305.1 |
| 146.9  | 304.3 |
| 147.0  | 303.8 |
| 147.1  | 302.9 |
| 147.2  | 301 |
| 147.3  | 298.9 |
| 147.4  | 295.4 |
| 147.5  | 292.6 |
| 147.6  | 296.6 |
| 147.7  | 297.7 |
| 147.8  | 298.8 |
| 147.9  | 298.8 |
| 148.0  | 298.8 |
| 148.1  | 296.9 |
| 148.2  | 295.7 |
| 148.3  | 294.6 |
| 148.4  | 293.2 |
| 148.5  | 291.6 |
| 148.6  | 290.8 |
| 148.7  | 290 |
| 148.8  | 289.2 |
| 148.9  | 288.9 |
| 149.0  | 289 |
| 149.1  | 288.6 |
| 149.2  | 288.5 |
| 149.3  | 287.1 |
| 149.4  | 286.1 |
| 149.5  | 285.1 |
| 149.6  | 284.6 |
| 149.7  | 283.7 |
| 149.8  | 283.9 |
| 149.9  | 283.7 |
| 150.0  | 283.3 |
| 150.1  | 282.5 |
| 150.2  | 280 |
| 150.3  | 279 |
| 150.4  | 278 |
| 150.5  | 276 |
| 150.6  | 275 |
| 150.7  | 274 |
| 150.8  | 274 |
| 150.9  | 274 |
| 151.0  | 273 |
| 151.1  | 272 |
| 151.2  | 271 |
| 151.3  | 269 |
| 151.4  | 266 |
| 151.5  | 267 |
| 151.6  | 265 |
| 151.7  | 266 |
| 151.8  | 264 |
| 151.9  | 264 |
| 152.0  | 264 |
| 152.1  | 263 |
| 152.2  | 261.7 |
| 152.3  | 261 |
| 152.4  | 260 |
| 152.5  | 259.7 |
| 152.6  | 259.7 |
| 152.7  | 260.7 |
| 152.8  | 254.4 |
| 152.9  | 252 |
| 153.0  | 260.3 |
| 153.1  | 257.1 |
| 153.2  | 253.4 |
| 153.3  | 254.7 |
| 153.4  | 255.6 |
| 153.5  | 255.4 |
| 153.6  | 254.7 |
| 153.7  | 254.7 |
| 153.8  | 254.1 |
| 153.9  | 253.2 |
| 154.0  | 252.5 |
| 154.1  | 250.9 |
| 154.2  | 250.5 |
| 154.3  | 250.3 |
| 154.4  | 251 |
| 154.5  | 251 |
| 154.6  | 251 |
| 154.7  | 249.9 |
| 154.8  | 249 |
| 154.9  | 248.5 |
| 155.0  | 249 |
| 155.1  | 249 |
| 155.2  | 247 |
| 155.3  | 246 |
| 155.4  | 245.1 |
| 155.5  | 245.4 |
| 155.6  | 244.9 |
| 155.7  | 243.4 |
| 155.8  | 242.8 |
| 155.9  | 245.5 |
| 156.0  | 245.7 |
| 156.1  | 245.6 |
| 156.2  | 242.7 |
| 156.3  | 240.1 |
| 156.4  | 238.7 |
| 156.5  | 238.2 |
| 156.6  | 240 |
| 156.7  | 233.6 |
| 156.8  | 240 |
| 156.9  | 236 |
| 157.0  | 234.4 |
| 157.1  | 233.1 |
| 157.2  | 232.6 |
| 157.3  | 231.4 |
| 157.4  | 231.3 |
| 157.5  | 230.7 |
| 157.6  | 229.7 |
| 157.7  | 228.3 |
| 157.8  | 228.4 |
| 157.9  | 227.9 |
| 158.0  | 226.6 |
| 158.1  | 226 |
| 158.2  | 225.7 |
| 158.3  | 225.1 |
| 158.4  | 224.6 |
| 158.5  | 223.6 |
| 158.6  | 223.7 |
| 158.7  | 222 |
| 158.8  | 221.1 |
| 158.9  | 221.8 |
| 159.0  | 223.1 |
| 159.1  | 222.1 |
| 159.2  | 220.6 |
| 159.3  | 223 |
| 159.4  | 223.1 |
| 159.5  | 224.2 |
| 159.6  | 225.6 |
| 159.7  | 226.8 |
| 159.8  | 227 |
| 159.9  | 226.4 |
| 160.0  | 225.2 |
| 160.1  | 221.9 |
| 160.2  | 220.6 |
| 160.3  | 222.1 |
| 160.4  | 220.2 |
| 160.5  | 218.8 |
| 160.6  | 217.9 |
| 160.7  | 219.4 |
| 160.8  | 216.4 |
| 160.9  | 215.4 |
| 161.0  | 213.8 |
| 161.1  | 213.2 |
| 161.2  | 212.5 |
| 161.3  | 211.4 |
| 161.4  | 210.9 |
| 161.5  | 211 |
| 161.6  | 210.7 |
| 161.7  | 209.8 |
| 161.8  | 209.6 |
| 161.9  | 209 |
| 162.0  | 210.3 |
| 162.1  | 207.8 |
| 162.2  | 209.8 |
| 162.3  | 212.1 |
| 162.4  | 212.6 |
| 162.5  | 216 |
| 162.6  | 218.4 |
| 162.7  | 214 |
| 162.8  | 214 |
| 162.9  | 214 |
| 163.0  | 216 |
| 163.1  | 218 |
| 163.2  | 219 |
| 163.3  | 219 |
| 163.4  | 225 |
| 163.5  | 228 |
| 163.6  | 233 |
| 163.7  | 234 |
| 163.8  | 238 |
| 163.9  | 246 |
| 164.0  | 249 |
| 164.1  | 253 |
| 164.2  | 258 |
| 164.3  | 264 |
| 164.4  | 257 |
| 164.5  | 252 |
| 164.6  | 243 |
| 164.7  | 238 |
| 164.8  | 230 |
| 164.9  | 230 |
| 165.0  | 229 |
| 165.1  | 228 |
| 165.2  | 225 |
| 165.3  | 227 |
| 165.4  | 228 |
| 165.5  | 227 |
| 165.6  | 216 |
| 165.7  | 206 |
| 165.8  | 197.5 |
| 165.9  | 195 |
| 166.0  | 194.8 |
| 166.1  | 193.1 |
| 166.2  | 193.6 |
| 166.3  | 196.8 |
| 166.4  | 200 |
| 166.5  | 200.9 |
| 166.6  | 204.9 |
| 166.7  | 215 |
| 166.8  | 223 |
| 166.9  | 224 |
| 167.0  | 221 |
| 167.1  | 225 |
| 167.2  | 221 |
| 167.3  | 219 |
| 167.4  | 219 |
| 167.5  | 219 |
| 167.6  | 218 |
| 167.7  | 219 |
| 167.8  | 219 |
| 167.9  | 219 |
| 168.0  | 219 |
| 168.1  | 220 |
| 168.2  | 219 |
| 168.3  | 219 |
| 168.4  | 224 |
| 168.5  | 226 |
| 168.6  | 222 |
| 168.7  | 220 |
| 168.8  | 218 |
| 168.9  | 219 |
| 169.0  | 219 |
| 169.1  | 219 |
| 169.2  | 220 |
| 169.3  | 220 |
| 169.4  | 222 |
| 169.5  | 227 |
| 169.6  | 234 |
| 169.7  | 238 |
| 169.8  | 245 |
| 169.9  | 245 |
| 170.0  | 248 |
| 170.1  | 258 |
| 170.2  | 264 |
| 170.3  | 273 |
| 170.4  | 288 |
| 170.5  | 278 |
| 170.6  | 273 |
| 170.7  | 265 |
| 170.8  | 263 |
| 170.9  | 256 |
| 171.0  | 247 |
| 171.1  | 237 |
| 171.2  | 229 |
| 171.3  | 224 |
| 171.4  | 227 |
| 171.5  | 219 |
| 171.6  | 218 |
| 171.7  | 215 |
| 171.8  | 215 |
| 171.9  | 213 |
| 172.0  | 213 |
| 172.1  | 208 |
| 172.2  | 206 |
| 172.3  | 203 |
| 172.4  | 199 |
| 172.5  | 199 |
| 172.6  | 198 |
| 172.7  | 197 |
| 172.8  | 192 |
| 172.9  | 190 |
| 173.0  | 189 |
| 173.1  | 187 |
| 173.2  | 185 |
| 173.3  | 183 |
| 173.4  | 180 |
| 173.5  | 179 |
| 173.6  | 179 |
| 173.7  | 178 |
| 173.8  | 176 |
| 173.9  | 175 |
| 174.0  | 175 |
| 174.1  | 175 |
| 174.2  | 175 |
| 174.3  | 172 |
| 174.4  | 171 |
| 174.5  | 171 |
| 174.6  | 171 |
| 174.7  | 171 |
| 174.8  | 171 |
| 174.9  | 169 |
| 175.0  | 169 |
| 175.1  | 169 |
| 175.2  | 168 |
| 175.3  | 166 |
| 175.4  | 164 |
| 175.5  | 168 |
| 175.6  | 169 |
| 175.7  | 168 |
| 175.8  | 166 |
| 175.9  | 166 |
| 176.0  | 163 |
| 176.1  | 160 |
| 176.2  | 160 |
| 176.3  | 160 |
| 176.4  | 159 |
| 176.5  | 155.5 |
| 176.6  | 154.1 |
| 176.7  | 154.3 |
| 176.8  | 153.9 |
| 176.9  | 152.1 |
| 177.0  | 152 |
| 177.1  | 151.3 |
| 177.2  | 151.1 |
| 177.3  | 150.3 |
| 177.4  | 151.7 |
| 177.5  | 150.5 |
| 177.6  | 149.8 |
| 177.7  | 149.5 |
| 177.8  | 149 |
| 177.9  | 149.8 |
| 178.0  | 150.3 |
| 178.1  | 150.9 |
| 178.2  | 151.5 |
| 178.3  | 152.1 |
| 178.4  | 152.5 |
| 178.5  | 153.3 |
| 178.6  | 154.2 |
| 178.7  | 153.6 |
| 178.8  | 154 |
| 178.9  | 154.4 |
| 179.0  | 154.6 |
| 179.1  | 154.9 |
| 179.2  | 155.2 |
| 179.3  | 157.7 |
| 179.4  | 160.3 |
| 179.5  | 163.2 |
| 179.6  | 164.1 |
| 179.7  | 165.9 |
| 179.8  | 169 |
| Finish | 171 |